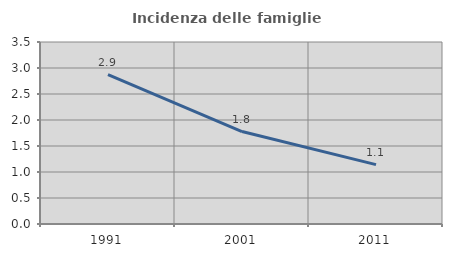
| Category | Incidenza delle famiglie numerose |
|---|---|
| 1991.0 | 2.872 |
| 2001.0 | 1.778 |
| 2011.0 | 1.142 |